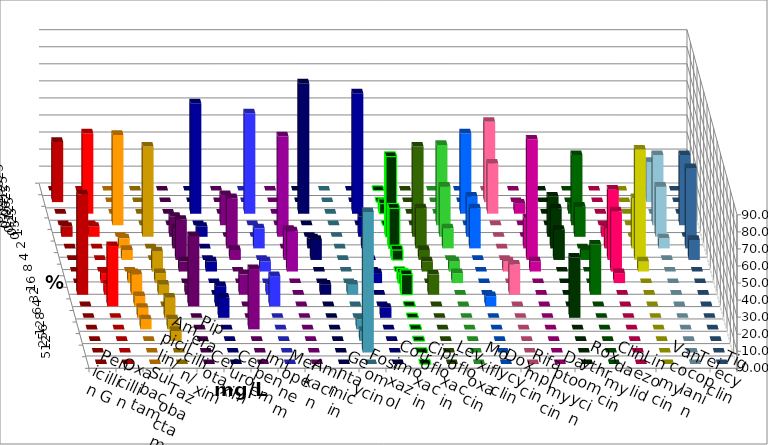
| Category | Penicillin G | Oxacillin | Ampicillin/ Sulbactam | Piperacillin/ Tazobactam | Cefotaxim | Cefuroxim | Imipenem | Meropenem | Amikacin | Gentamicin | Fosfomycin | Cotrimoxazol | Ciprofloxacin | Levofloxacin | Moxifloxacin | Doxycyclin | Rifampicin | Daptomycin | Roxythromycin | Clindamycin | Linezolid | Vancomycin | Teicoplanin | Tigecyclin |
|---|---|---|---|---|---|---|---|---|---|---|---|---|---|---|---|---|---|---|---|---|---|---|---|---|
| 0.015625 | 0 | 0 | 0 | 0 | 0 | 0 | 0 | 0 | 0 | 0 | 0 | 0 | 0 | 0 | 0 | 0 | 0 | 0 | 0 | 0 | 0 | 0 | 0 | 0 |
| 0.03125 | 35.294 | 0 | 0 | 0 | 0 | 0 | 0 | 0 | 0 | 0 | 0 | 0 | 0 | 0 | 0 | 0 | 47.059 | 0 | 0 | 0 | 0 | 0 | 0 | 23.529 |
| 0.0625 | 0 | 47.059 | 0 | 0 | 0 | 0 | 64.706 | 58.824 | 0 | 76.471 | 0 | 70.588 | 5.882 | 0 | 0 | 47.059 | 29.412 | 5.882 | 0 | 5.882 | 0 | 0 | 0 | 0 |
| 0.125 | 0 | 0 | 52.941 | 0 | 0 | 17.647 | 0 | 0 | 0 | 0 | 0 | 0 | 0 | 0 | 47.059 | 0 | 0 | 0 | 0 | 41.176 | 0 | 0 | 41.176 | 41.176 |
| 0.25 | 5.882 | 5.882 | 0 | 52.941 | 11.765 | 0 | 5.882 | 0 | 58.824 | 0 | 0 | 11.765 | 47.059 | 52.941 | 29.412 | 23.529 | 0 | 0 | 23.529 | 17.647 | 5.882 | 0 | 0 | 29.412 |
| 0.5 | 0 | 0 | 5.882 | 0 | 11.765 | 29.412 | 0 | 11.765 | 0 | 5.882 | 0 | 5.882 | 23.529 | 23.529 | 11.765 | 23.529 | 0 | 17.647 | 23.529 | 0 | 11.765 | 29.412 | 47.059 | 5.882 |
| 1.0 | 0 | 0 | 5.882 | 0 | 23.529 | 5.882 | 0 | 0 | 17.647 | 11.765 | 0 | 0 | 5.882 | 5.882 | 0 | 0 | 0 | 70.588 | 17.647 | 5.882 | 41.176 | 64.706 | 11.765 | 0 |
| 2.0 | 0 | 0 | 0 | 11.765 | 5.882 | 0 | 5.882 | 5.882 | 23.529 | 0 | 0 | 0 | 0 | 5.882 | 5.882 | 0 | 5.882 | 5.882 | 0 | 0 | 35.294 | 5.882 | 0 | 0 |
| 4.0 | 0 | 5.882 | 5.882 | 5.882 | 0 | 0 | 0 | 0 | 0 | 0 | 0 | 5.882 | 5.882 | 0 | 5.882 | 0 | 0 | 0 | 0 | 0 | 5.882 | 0 | 0 | 0 |
| 8.0 | 58.824 | 5.882 | 11.765 | 5.882 | 5.882 | 11.765 | 0 | 5.882 | 0 | 5.882 | 5.882 | 0 | 11.765 | 11.765 | 0 | 0 | 17.647 | 0 | 0 | 29.412 | 0 | 0 | 0 | 0 |
| 16.0 | 0 | 35.294 | 5.882 | 0 | 41.176 | 0 | 11.765 | 17.647 | 0 | 0 | 0 | 0 | 0 | 0 | 0 | 5.882 | 0 | 0 | 0 | 0 | 0 | 0 | 0 | 0 |
| 32.0 | 0 | 0 | 5.882 | 11.765 | 0 | 0 | 11.765 | 0 | 0 | 0 | 0 | 5.882 | 0 | 0 | 0 | 0 | 0 | 0 | 35.294 | 0 | 0 | 0 | 0 | 0 |
| 64.0 | 0 | 0 | 5.882 | 5.882 | 0 | 35.294 | 0 | 0 | 0 | 0 | 5.882 | 0 | 0 | 0 | 0 | 0 | 0 | 0 | 0 | 0 | 0 | 0 | 0 | 0 |
| 128.0 | 0 | 0 | 0 | 5.882 | 0 | 0 | 0 | 0 | 0 | 0 | 5.882 | 0 | 0 | 0 | 0 | 0 | 0 | 0 | 0 | 0 | 0 | 0 | 0 | 0 |
| 256.0 | 0 | 0 | 0 | 0 | 0 | 0 | 0 | 0 | 0 | 0 | 82.353 | 0 | 0 | 0 | 0 | 0 | 0 | 0 | 0 | 0 | 0 | 0 | 0 | 0 |
| 512.0 | 0 | 0 | 0 | 0 | 0 | 0 | 0 | 0 | 0 | 0 | 0 | 0 | 0 | 0 | 0 | 0 | 0 | 0 | 0 | 0 | 0 | 0 | 0 | 0 |